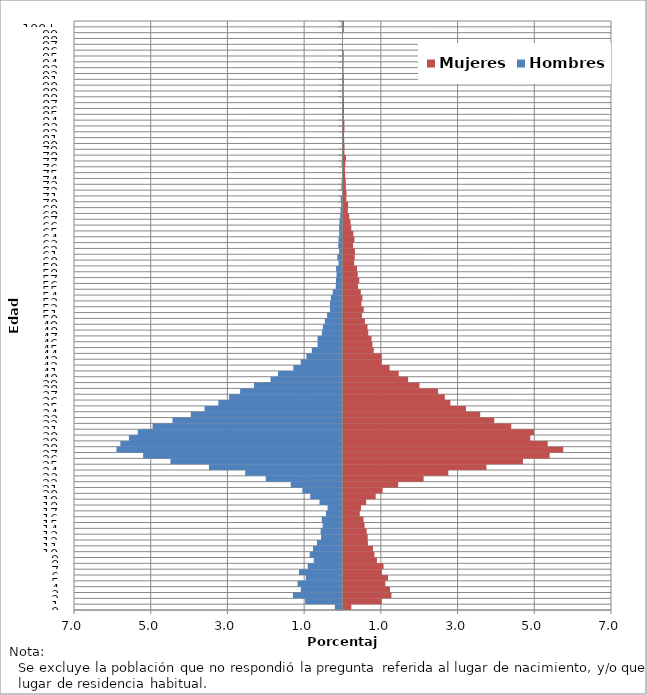
| Category | Hombres | Mujeres |
|---|---|---|
| 0 | -0.199 | 0.203 |
| 1 | -0.973 | 0.997 |
| 2 | -1.292 | 1.25 |
| 3 | -1.086 | 1.213 |
| 4 | -1.173 | 1.091 |
| 5 | -0.959 | 1.161 |
| 6 | -1.135 | 1 |
| 7 | -0.905 | 1.044 |
| 8 | -0.75 | 0.871 |
| 9 | -0.856 | 0.807 |
| 10 | -0.769 | 0.77 |
| 11 | -0.666 | 0.636 |
| 12 | -0.558 | 0.631 |
| 13 | -0.57 | 0.604 |
| 14 | -0.518 | 0.549 |
| 15 | -0.542 | 0.522 |
| 16 | -0.432 | 0.423 |
| 17 | -0.389 | 0.455 |
| 18 | -0.6 | 0.592 |
| 19 | -0.842 | 0.839 |
| 20 | -1.046 | 1.02 |
| 21 | -1.348 | 1.426 |
| 22 | -2 | 2.089 |
| 23 | -2.537 | 2.732 |
| 24 | -3.483 | 3.727 |
| 25 | -4.486 | 4.678 |
| 26 | -5.197 | 5.376 |
| 27 | -5.893 | 5.73 |
| 28 | -5.793 | 5.324 |
| 29 | -5.57 | 4.871 |
| 30 | -5.338 | 4.967 |
| 31 | -4.951 | 4.373 |
| 32 | -4.432 | 3.93 |
| 33 | -3.956 | 3.564 |
| 34 | -3.597 | 3.193 |
| 35 | -3.236 | 2.787 |
| 36 | -2.957 | 2.641 |
| 37 | -2.669 | 2.465 |
| 38 | -2.308 | 1.98 |
| 39 | -1.876 | 1.685 |
| 40 | -1.681 | 1.44 |
| 41 | -1.283 | 1.2 |
| 42 | -1.09 | 1 |
| 43 | -0.94 | 0.997 |
| 44 | -0.8 | 0.79 |
| 45 | -0.65 | 0.755 |
| 46 | -0.65 | 0.73 |
| 47 | -0.537 | 0.646 |
| 48 | -0.514 | 0.626 |
| 49 | -0.462 | 0.559 |
| 50 | -0.401 | 0.483 |
| 51 | -0.326 | 0.527 |
| 52 | -0.326 | 0.468 |
| 53 | -0.305 | 0.493 |
| 54 | -0.256 | 0.45 |
| 55 | -0.176 | 0.379 |
| 56 | -0.169 | 0.411 |
| 57 | -0.155 | 0.371 |
| 58 | -0.167 | 0.354 |
| 59 | -0.103 | 0.277 |
| 60 | -0.136 | 0.292 |
| 61 | -0.089 | 0.297 |
| 62 | -0.11 | 0.248 |
| 63 | -0.103 | 0.285 |
| 64 | -0.084 | 0.257 |
| 65 | -0.089 | 0.203 |
| 66 | -0.08 | 0.183 |
| 67 | -0.061 | 0.149 |
| 68 | -0.052 | 0.114 |
| 69 | -0.035 | 0.121 |
| 70 | -0.047 | 0.074 |
| 71 | -0.012 | 0.079 |
| 72 | -0.03 | 0.062 |
| 73 | -0.023 | 0.059 |
| 74 | -0.014 | 0.045 |
| 75 | -0.009 | 0.037 |
| 76 | -0.023 | 0.047 |
| 77 | -0.016 | 0.064 |
| 78 | -0.014 | 0.025 |
| 79 | -0.002 | 0.027 |
| 80 | -0.007 | 0.017 |
| 81 | -0.005 | 0.012 |
| 82 | -0.009 | 0.025 |
| 83 | -0.002 | 0.022 |
| 84 | -0.007 | 0.002 |
| 85 | -0.009 | 0.012 |
| 86 | -0.005 | 0.012 |
| 87 | 0 | 0.01 |
| 88 | -0.005 | 0.002 |
| 89 | -0.007 | 0.002 |
| 90 | 0 | 0.01 |
| 91 | -0.002 | 0.007 |
| 92 | -0.002 | 0 |
| 93 | 0 | 0.002 |
| 94 | 0 | 0.005 |
| 95 | -0.002 | 0.002 |
| 96 | 0 | 0 |
| 97 | 0 | 0 |
| 98 | 0 | 0 |
| 99 | -0.002 | 0.002 |
| 100+ | -0.023 | 0.01 |